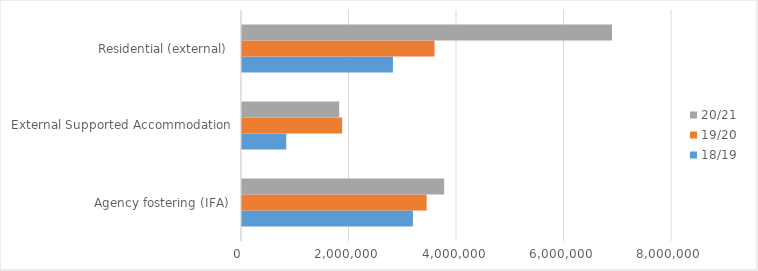
| Category | 18/19 | 19/20 | 20/21 |
|---|---|---|---|
| Agency fostering (IFA) | 3180481 | 3435243 | 3760913 |
| External Supported Accommodation | 823631 | 1863429 | 1808471 |
| Residential (external) | 2807972 | 3582836 | 6884213 |